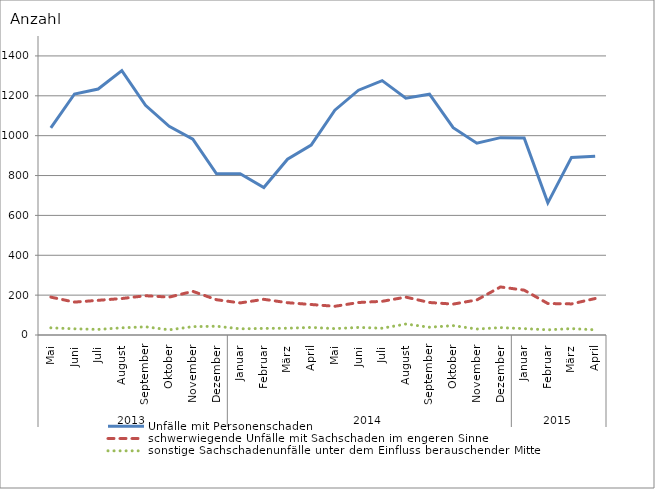
| Category | Unfälle mit Personenschaden | schwerwiegende Unfälle mit Sachschaden im engeren Sinne | sonstige Sachschadenunfälle unter dem Einfluss berauschender Mittel |
|---|---|---|---|
| 0 | 1039 | 190 | 36 |
| 1 | 1209 | 165 | 31 |
| 2 | 1234 | 174 | 28 |
| 3 | 1326 | 183 | 36 |
| 4 | 1152 | 197 | 41 |
| 5 | 1047 | 190 | 26 |
| 6 | 983 | 219 | 42 |
| 7 | 809 | 177 | 44 |
| 8 | 809 | 161 | 31 |
| 9 | 740 | 179 | 33 |
| 10 | 882 | 162 | 34 |
| 11 | 953 | 153 | 38 |
| 12 | 1128 | 144 | 32 |
| 13 | 1228 | 163 | 38 |
| 14 | 1276 | 169 | 34 |
| 15 | 1188 | 190 | 55 |
| 16 | 1208 | 163 | 39 |
| 17 | 1040 | 155 | 47 |
| 18 | 962 | 176 | 30 |
| 19 | 990 | 241 | 37 |
| 20 | 988 | 225 | 32 |
| 21 | 663 | 158 | 26 |
| 22 | 891 | 156 | 32 |
| 23 | 897 | 183 | 26 |